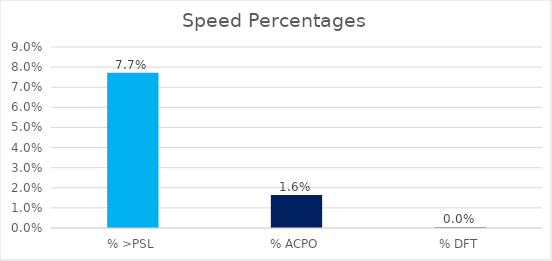
| Category | Series 0 |
|---|---|
| % >PSL | 0.077 |
| % ACPO | 0.016 |
| % DFT | 0 |